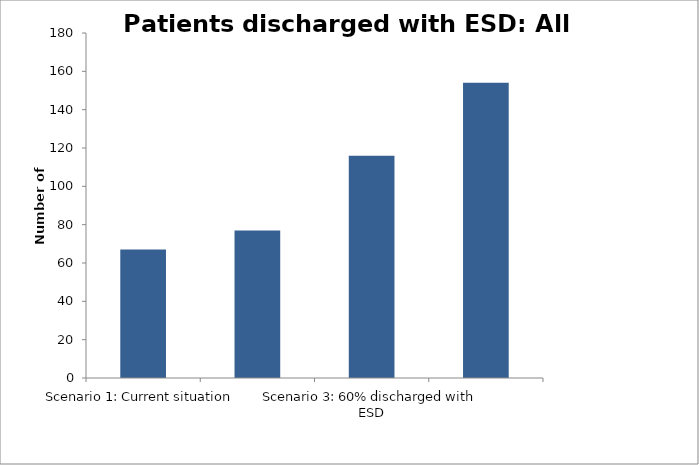
| Category | Number of patients |
|---|---|
| Scenario 1: Current situation | 67 |
| Scenario 2: 40% discharged with ESD | 77 |
| Scenario 3: 60% discharged with ESD | 116 |
| Scenario 4: 80% discharged with ESD | 154 |